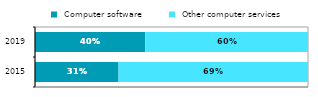
| Category |  Computer software |  Other computer services |
|---|---|---|
| 2015.0 | 0.306 | 0.694 |
| 2019.0 | 0.404 | 0.596 |